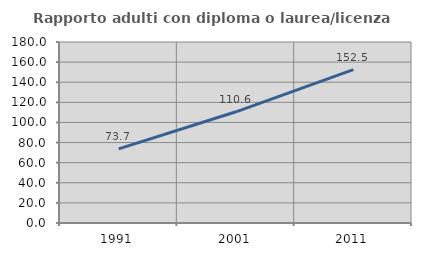
| Category | Rapporto adulti con diploma o laurea/licenza media  |
|---|---|
| 1991.0 | 73.69 |
| 2001.0 | 110.581 |
| 2011.0 | 152.496 |